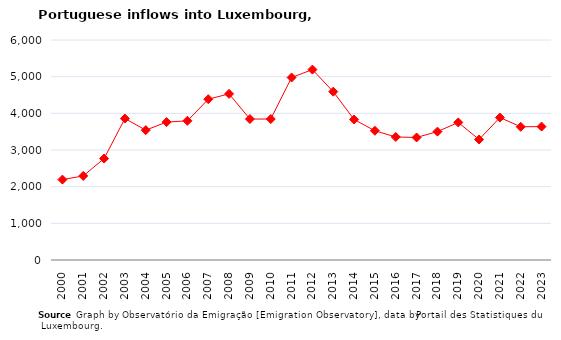
| Category | Entradas |
|---|---|
| 2000.0 | 2193 |
| 2001.0 | 2293 |
| 2002.0 | 2767 |
| 2003.0 | 3857 |
| 2004.0 | 3542 |
| 2005.0 | 3761 |
| 2006.0 | 3796 |
| 2007.0 | 4385 |
| 2008.0 | 4531 |
| 2009.0 | 3844 |
| 2010.0 | 3845 |
| 2011.0 | 4977 |
| 2012.0 | 5193 |
| 2013.0 | 4590 |
| 2014.0 | 3832 |
| 2015.0 | 3525 |
| 2016.0 | 3355 |
| 2017.0 | 3342 |
| 2018.0 | 3501 |
| 2019.0 | 3752 |
| 2020.0 | 3286 |
| 2021.0 | 3885 |
| 2022.0 | 3633 |
| 2023.0 | 3638 |